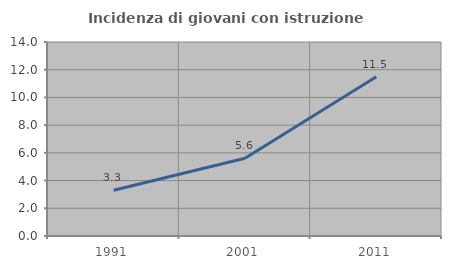
| Category | Incidenza di giovani con istruzione universitaria |
|---|---|
| 1991.0 | 3.297 |
| 2001.0 | 5.607 |
| 2011.0 | 11.494 |